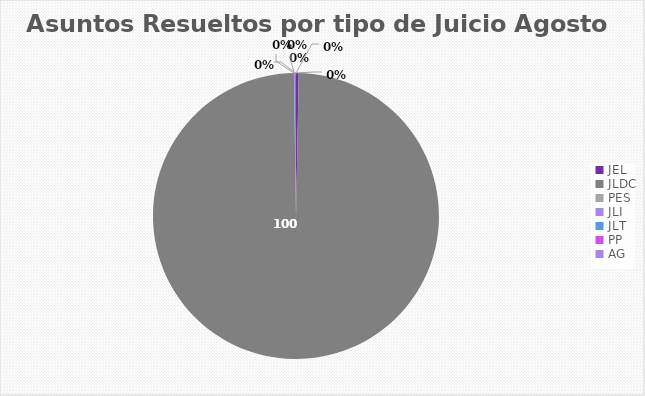
| Category | Asuntos Resueltos por tipo de Juicio  AGOSTO |
|---|---|
| JEL | 4 |
| JLDC | 1298 |
| PES | 0 |
| JLI | 0 |
| JLT | 1 |
| PP | 2 |
| AG | 0 |